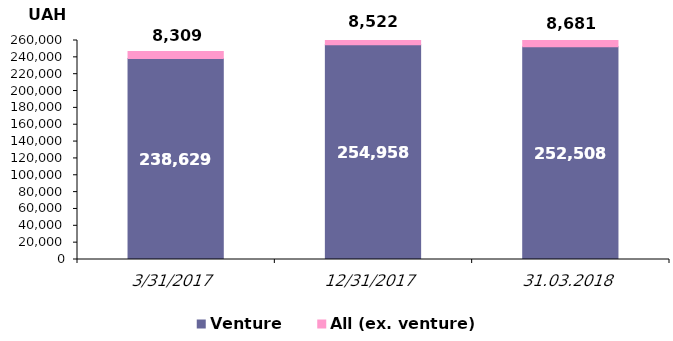
| Category | Venture | All (ex. venture) |
|---|---|---|
| 31.03.2017 | 238628.798 | 8309.226 |
| 31.12.2017 | 254957.863 | 8521.52 |
| 31.03.2018 | 252508.217 | 8680.52 |